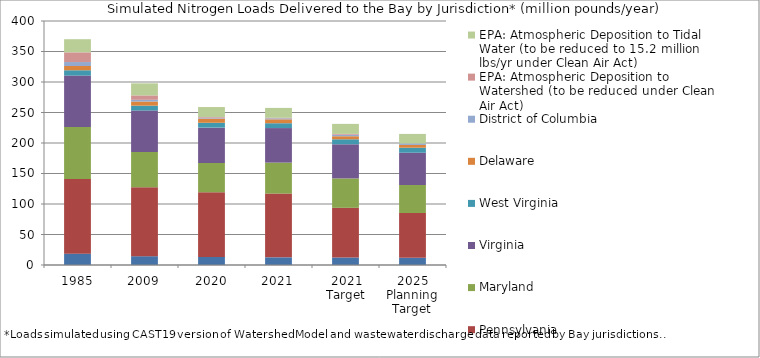
| Category | New York  | Pennsylvania  | Maryland  | Virginia  | West Virginia  | Delaware  | District of Columbia  | EPA: Atmospheric Deposition to Watershed (to be reduced under Clean Air Act) | EPA: Atmospheric Deposition to Tidal Water (to be reduced to 15.2 million lbs/yr under Clean Air Act) |
|---|---|---|---|---|---|---|---|---|---|
| 1985 | 18.636 | 122.228 | 85.333 | 84.338 | 8.7 | 7 | 6.479 | 15.901 | 21.521 |
| 2009 | 14.421 | 113.225 | 57.608 | 67.91 | 8.036 | 6.851 | 2.762 | 7.184 | 19.804 |
| 2020 | 13.241 | 105.993 | 47.96 | 58.001 | 7.958 | 6.901 | 1.417 | 1.104 | 16.341 |
| 2021 | 12.611 | 104.495 | 50.74 | 56.642 | 7.925 | 6.389 | 1.652 | 0.882 | 16.19 |
| 2021 Target | 12.322 | 81.438 | 48.187 | 55.945 | 8.189 | 5.01 | 2.492 | 1.35 | 16.39 |
| 2025 Planning Target | 11.797 | 73.491 | 45.832 | 52.954 | 8.227 | 4.55 | 2.425 | 0 | 15.601 |